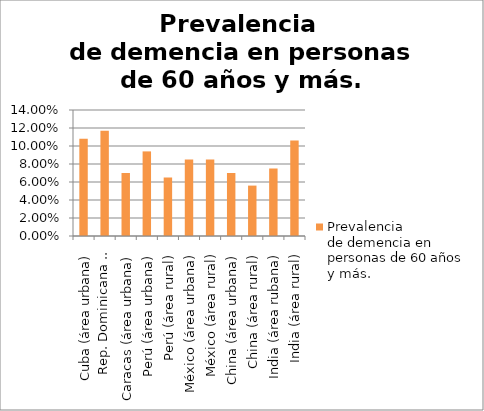
| Category | Prevalencia 
de demencia en personas de 60 años y más. |
|---|---|
| Cuba (área urbana) | 0.108 |
| Rep. Dominicana 
(área urbana) | 0.117 |
| Caracas (área urbana) | 0.07 |
| Perú (área urbana) | 0.094 |
| Perú (área rural) | 0.065 |
| México (área urbana) | 0.085 |
| México (área rural) | 0.085 |
| China (área urbana) | 0.07 |
| China (área rural) | 0.056 |
| India (área rubana) | 0.075 |
| India (área rural) | 0.106 |